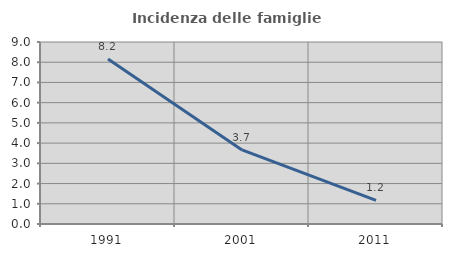
| Category | Incidenza delle famiglie numerose |
|---|---|
| 1991.0 | 8.163 |
| 2001.0 | 3.665 |
| 2011.0 | 1.171 |